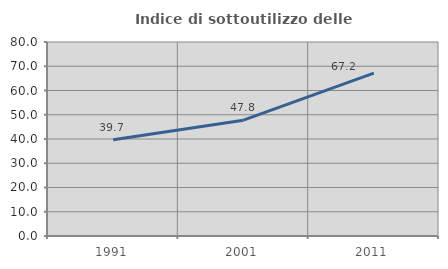
| Category | Indice di sottoutilizzo delle abitazioni  |
|---|---|
| 1991.0 | 39.726 |
| 2001.0 | 47.761 |
| 2011.0 | 67.164 |